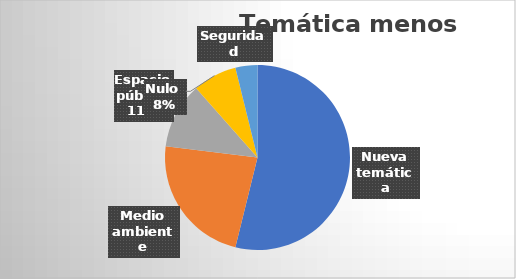
| Category | Series 0 |
|---|---|
| Nueva temática | 14 |
| Medio ambiente | 6 |
| Espacio público | 3 |
| Nulo  | 2 |
| Seguridad | 1 |